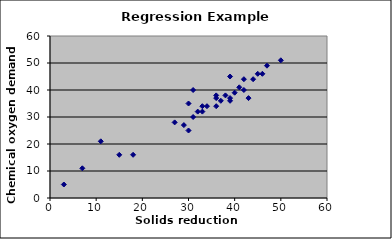
| Category | % chemical oxygen demand |
|---|---|
| 3.0 | 5 |
| 7.0 | 11 |
| 11.0 | 21 |
| 15.0 | 16 |
| 18.0 | 16 |
| 27.0 | 28 |
| 29.0 | 27 |
| 30.0 | 25 |
| 30.0 | 35 |
| 31.0 | 30 |
| 31.0 | 40 |
| 32.0 | 32 |
| 33.0 | 34 |
| 33.0 | 32 |
| 34.0 | 34 |
| 36.0 | 37 |
| 36.0 | 38 |
| 36.0 | 34 |
| 37.0 | 36 |
| 38.0 | 38 |
| 39.0 | 37 |
| 39.0 | 36 |
| 39.0 | 45 |
| 40.0 | 39 |
| 41.0 | 41 |
| 42.0 | 40 |
| 42.0 | 44 |
| 43.0 | 37 |
| 44.0 | 44 |
| 45.0 | 46 |
| 46.0 | 46 |
| 47.0 | 49 |
| 50.0 | 51 |